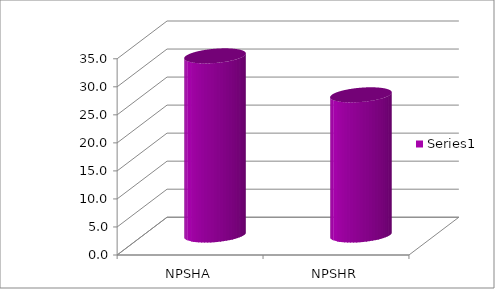
| Category | Series 0 |
|---|---|
| NPSHA | 31.948 |
| NPSHR | 25 |